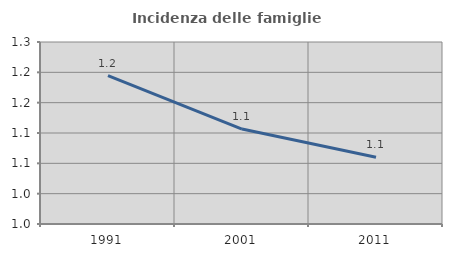
| Category | Incidenza delle famiglie numerose |
|---|---|
| 1991.0 | 1.195 |
| 2001.0 | 1.107 |
| 2011.0 | 1.06 |